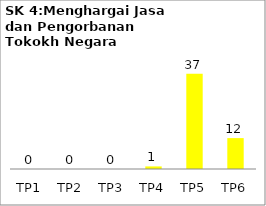
| Category | Bil Pel |
|---|---|
| TP1 | 0 |
| TP2 | 0 |
| TP3 | 0 |
| TP4 | 1 |
| TP5 | 37 |
| TP6 | 12 |